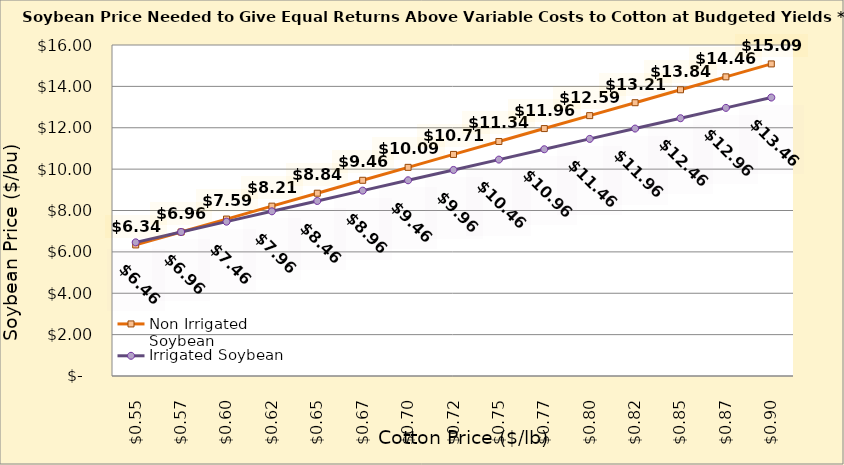
| Category | Non Irrigated Soybean | Irrigated Soybean |
|---|---|---|
| 0.5449999999999998 | 6.336 | 6.461 |
| 0.5699999999999998 | 6.961 | 6.961 |
| 0.5949999999999999 | 7.586 | 7.461 |
| 0.6199999999999999 | 8.211 | 7.961 |
| 0.6449999999999999 | 8.836 | 8.461 |
| 0.6699999999999999 | 9.461 | 8.961 |
| 0.695 | 10.086 | 9.461 |
| 0.72 | 10.711 | 9.961 |
| 0.745 | 11.336 | 10.461 |
| 0.77 | 11.961 | 10.961 |
| 0.795 | 12.586 | 11.461 |
| 0.8200000000000001 | 13.211 | 11.961 |
| 0.8450000000000001 | 13.836 | 12.461 |
| 0.8700000000000001 | 14.461 | 12.961 |
| 0.8950000000000001 | 15.086 | 13.461 |